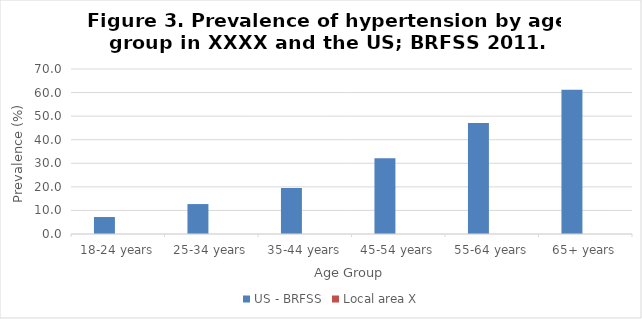
| Category | US - BRFSS | Local area X |
|---|---|---|
| 18-24 years | 7.2 |  |
| 25-34 years | 12.7 |  |
| 35-44 years | 19.5 |  |
| 45-54 years | 32.1 |  |
| 55-64 years | 47.1 |  |
| 65+ years | 61.2 |  |